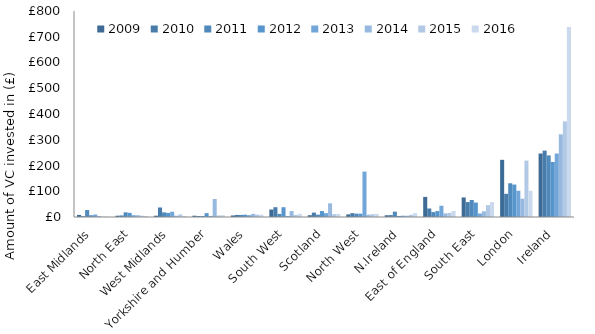
| Category | 2009 | 2010 | 2011 | 2012 | 2013 | 2014 | 2015 | 2016 |
|---|---|---|---|---|---|---|---|---|
| East Midlands | 8 | 3 | 27 | 7 | 9.52 | 4 | 1 | 1 |
| North East | 5 | 6 | 18 | 16 | 6.959 | 7 | 5 | 4 |
| West Midlands | 5 | 37 | 18 | 16 | 20.483 | 5 | 10 | 4 |
| Yorkshire and Humber | 5 | 4 | 4 | 15 | 4.09 | 70 | 6 | 7 |
| Wales | 6 | 8 | 8 | 9 | 7.177 | 12 | 9 | 9 |
| South West | 29 | 38 | 12 | 38 | 3.757 | 23 | 8 | 12 |
| Scotland | 7 | 17 | 9 | 23 | 14.953 | 53 | 11 | 12 |
| North West | 10 | 15 | 13 | 13 | 176.31 | 9 | 11 | 12 |
| N.Ireland | 6.764 | 7.363 | 20.78 | 4.108 | 5.061 | 4.99 | 8.43 | 14.83 |
| East of England | 78 | 33 | 19 | 23 | 43.714 | 14 | 16 | 23 |
| South East | 76 | 58 | 66 | 56 | 13.659 | 22 | 46 | 58 |
| London | 222 | 90 | 131 | 126 | 101.967 | 71 | 219 | 102 |
| Ireland | 246.553 | 257.863 | 239.194 | 213.815 | 246.478 | 321.119 | 371.228 | 738.062 |